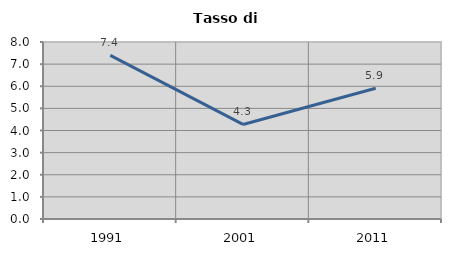
| Category | Tasso di disoccupazione   |
|---|---|
| 1991.0 | 7.399 |
| 2001.0 | 4.274 |
| 2011.0 | 5.909 |